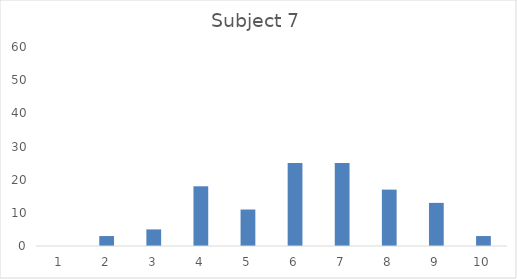
| Category | Series 0 |
|---|---|
| 0 | 0 |
| 1 | 3 |
| 2 | 5 |
| 3 | 18 |
| 4 | 11 |
| 5 | 25 |
| 6 | 25 |
| 7 | 17 |
| 8 | 13 |
| 9 | 3 |